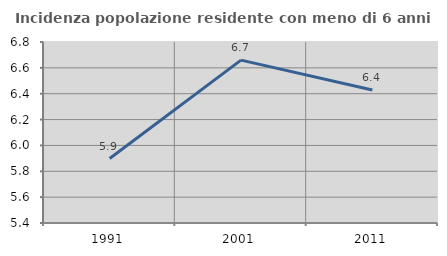
| Category | Incidenza popolazione residente con meno di 6 anni |
|---|---|
| 1991.0 | 5.899 |
| 2001.0 | 6.66 |
| 2011.0 | 6.428 |